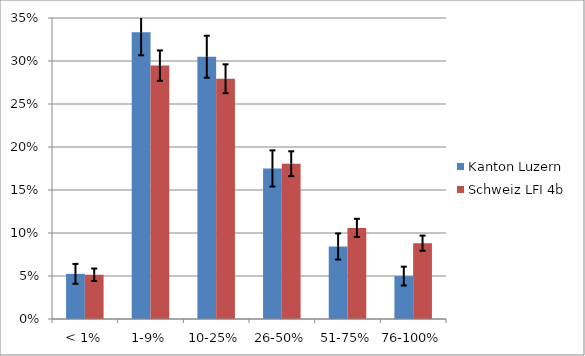
| Category | Kanton Luzern | Schweiz LFI 4b |
|---|---|---|
| < 1% | 0.053 | 0.051 |
| 1-9% | 0.333 | 0.295 |
| 10-25% | 0.305 | 0.279 |
| 26-50% | 0.175 | 0.181 |
| 51-75% | 0.084 | 0.106 |
| 76-100% | 0.05 | 0.088 |